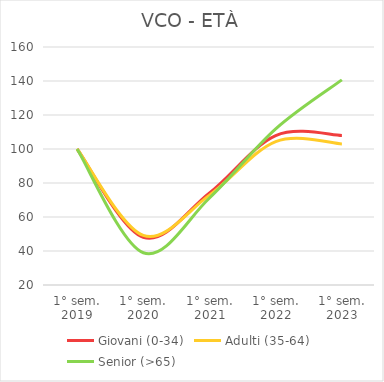
| Category | Giovani (0-34) | Adulti (35-64) | Senior (>65) |
|---|---|---|---|
| 1° sem.
2019 | 100 | 100 | 100 |
| 1° sem.
2020 | 48.071 | 49.148 | 38.983 |
| 1° sem.
2021 | 74.168 | 72.852 | 71.186 |
| 1° sem.
2022 | 107.905 | 104.386 | 111.864 |
| 1° sem.
2023 | 107.905 | 102.972 | 140.678 |